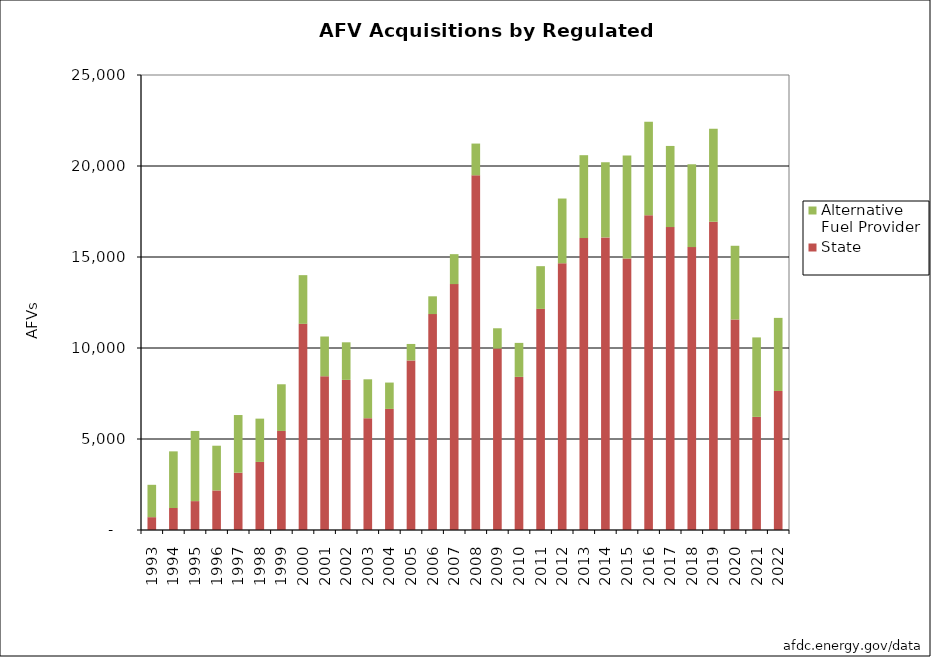
| Category | State   | Alternative Fuel Provider |
|---|---|---|
| 1993.0 | 705 | 1778 |
| 1994.0 | 1208 | 3113 |
| 1995.0 | 1587 | 3855 |
| 1996.0 | 2174 | 2457 |
| 1997.0 | 3148 | 3169 |
| 1998.0 | 3741 | 2378 |
| 1999.0 | 5443 | 2564 |
| 2000.0 | 11327 | 2676 |
| 2001.0 | 8448 | 2184 |
| 2002.0 | 8248 | 2065 |
| 2003.0 | 6143 | 2137 |
| 2004.0 | 6652 | 1449 |
| 2005.0 | 9316 | 906 |
| 2006.0 | 11863 | 977 |
| 2007.0 | 13510 | 1646 |
| 2008.0 | 19488 | 1745 |
| 2009.0 | 9971 | 1113 |
| 2010.0 | 8412 | 1869 |
| 2011.0 | 12150 | 2346 |
| 2012.0 | 14655 | 3558 |
| 2013.0 | 16042 | 4552 |
| 2014.0 | 16077 | 4129 |
| 2015.0 | 14916 | 5655 |
| 2016.0 | 17296 | 5139 |
| 2017.0 | 16644 | 4458 |
| 2018.0 | 15544 | 4551 |
| 2019.0 | 16935 | 5107 |
| 2020.0 | 11566 | 4051 |
| 2021.0 | 6215 | 4367 |
| 2022.0 | 7639 | 4016 |